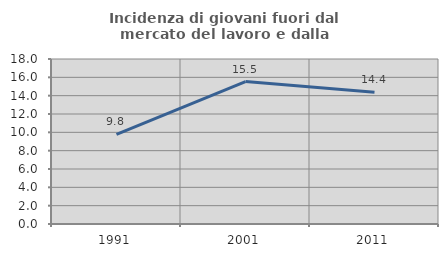
| Category | Incidenza di giovani fuori dal mercato del lavoro e dalla formazione  |
|---|---|
| 1991.0 | 9.767 |
| 2001.0 | 15.544 |
| 2011.0 | 14.375 |